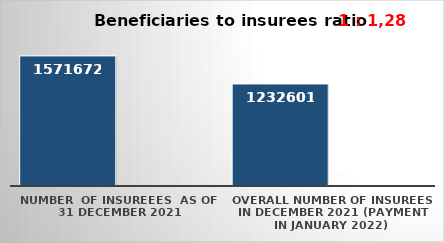
| Category | Series 0 | Series 1 |
|---|---|---|
| NUMBER  of insureees  as of  31 December 2021 | 1571672 |  |
| OVERALL number of insurees in December 2021 (payment in January 2022) | 1232601 |  |